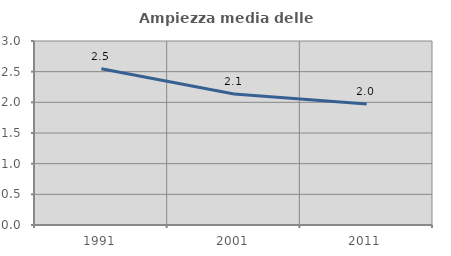
| Category | Ampiezza media delle famiglie |
|---|---|
| 1991.0 | 2.548 |
| 2001.0 | 2.135 |
| 2011.0 | 1.971 |